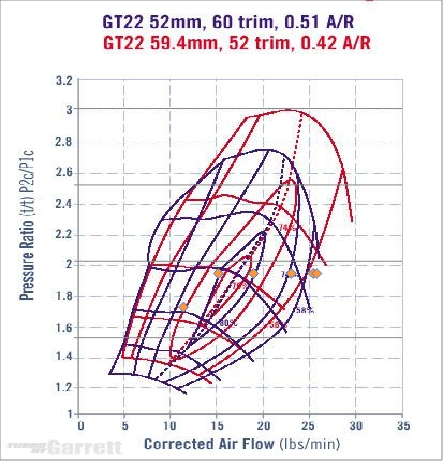
| Category | Series 0 |
|---|---|
| 11.390200287153347 | 1.7 |
| 15.167412396916376 | 1.92 |
| 18.959265496145473 | 1.92 |
| 23.031996602724867 | 1.92 |
| 25.41243771501869 | 1.92 |
| 25.80566692530911 | 1.92 |